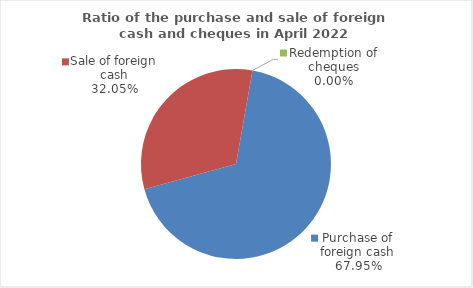
| Category | Series 0 |
|---|---|
| Purchase of foreign cash | 67.948 |
| Sale of foreign cash | 32.052 |
| Redemption of cheques | 0 |